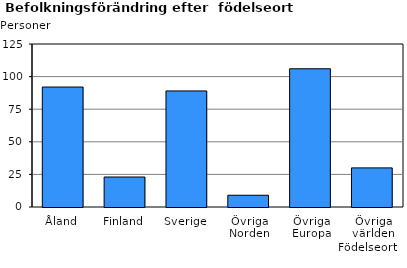
| Category | Series 0 |
|---|---|
| Åland | 92 |
| Finland | 23 |
| Sverige | 89 |
| Övriga Norden | 9 |
| Övriga Europa | 106 |
| Övriga världen | 30 |